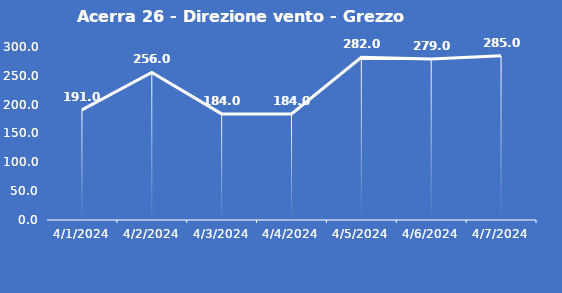
| Category | Acerra 26 - Direzione vento - Grezzo (°N) |
|---|---|
| 4/1/24 | 191 |
| 4/2/24 | 256 |
| 4/3/24 | 184 |
| 4/4/24 | 184 |
| 4/5/24 | 282 |
| 4/6/24 | 279 |
| 4/7/24 | 285 |